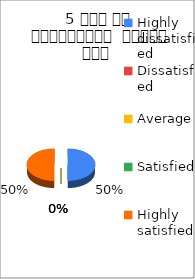
| Category | 5 समय पर पाठ्यक्रम  पूर्ण हुआ  |
|---|---|
| Highly dissatisfied | 1 |
| Dissatisfied | 0 |
| Average | 0 |
| Satisfied | 0 |
| Highly satisfied | 1 |